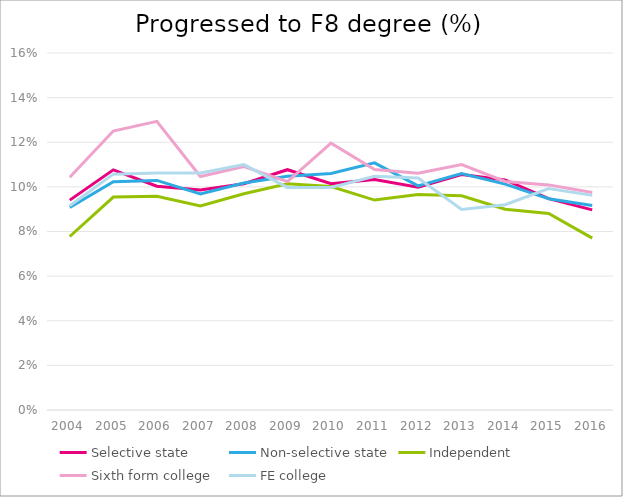
| Category | Selective state | Non-selective state | Independent | Sixth form college | FE college |
|---|---|---|---|---|---|
| 2004.0 | 0.094 | 0.091 | 0.078 | 0.104 | 0.092 |
| 2005.0 | 0.108 | 0.102 | 0.095 | 0.125 | 0.106 |
| 2006.0 | 0.1 | 0.103 | 0.096 | 0.129 | 0.106 |
| 2007.0 | 0.099 | 0.097 | 0.091 | 0.105 | 0.106 |
| 2008.0 | 0.101 | 0.102 | 0.097 | 0.109 | 0.11 |
| 2009.0 | 0.108 | 0.105 | 0.101 | 0.102 | 0.1 |
| 2010.0 | 0.101 | 0.106 | 0.1 | 0.12 | 0.1 |
| 2011.0 | 0.103 | 0.111 | 0.094 | 0.108 | 0.105 |
| 2012.0 | 0.1 | 0.1 | 0.097 | 0.106 | 0.104 |
| 2013.0 | 0.106 | 0.106 | 0.096 | 0.11 | 0.09 |
| 2014.0 | 0.103 | 0.101 | 0.09 | 0.102 | 0.092 |
| 2015.0 | 0.095 | 0.095 | 0.088 | 0.101 | 0.099 |
| 2016.0 | 0.09 | 0.092 | 0.077 | 0.098 | 0.096 |